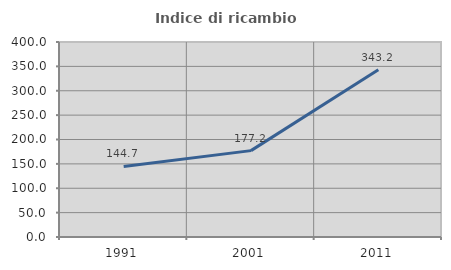
| Category | Indice di ricambio occupazionale  |
|---|---|
| 1991.0 | 144.722 |
| 2001.0 | 177.174 |
| 2011.0 | 343.233 |